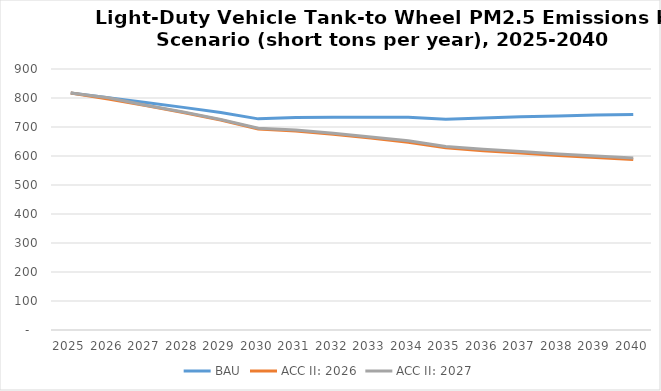
| Category | BAU | ACC II: 2026 | ACC II: 2027 |
|---|---|---|---|
| 2025.0 | 817.115 | 817.115 | 817.115 |
| 2026.0 | 800.907 | 796.728 | 800.907 |
| 2027.0 | 784.666 | 774.43 | 775.172 |
| 2028.0 | 767.677 | 750.282 | 751.506 |
| 2029.0 | 749.914 | 724.217 | 725.968 |
| 2030.0 | 728.034 | 693.278 | 695.561 |
| 2031.0 | 732.829 | 686.385 | 689.306 |
| 2032.0 | 733.667 | 674.756 | 678.283 |
| 2033.0 | 733.795 | 661.796 | 665.873 |
| 2034.0 | 733.294 | 647.784 | 652.332 |
| 2035.0 | 726.811 | 628.167 | 633.058 |
| 2036.0 | 731.107 | 618.503 | 623.673 |
| 2037.0 | 735.057 | 609.985 | 615.265 |
| 2038.0 | 738.217 | 601.515 | 606.785 |
| 2039.0 | 741.248 | 594.528 | 599.59 |
| 2040.0 | 743.499 | 588.137 | 592.817 |